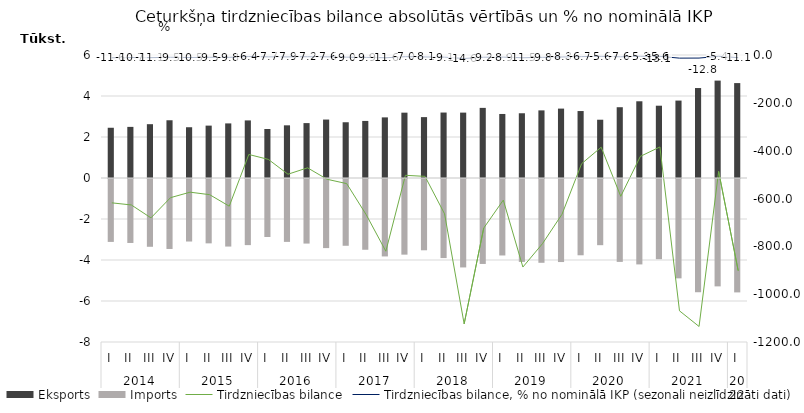
| Category | Eksports | Imports |
|---|---|---|
| 0 | 2450.7 | -3068.8 |
| 1 | 2493.4 | -3120.5 |
| 2 | 2625.5 | -3306.5 |
| 3 | 2816.7 | -3413.2 |
| 4 | 2476.5 | -3050.1 |
| 5 | 2555.2 | -3139.2 |
| 6 | 2663.4 | -3295.5 |
| 7 | 2809.5 | -3225.4 |
| 8 | 2391.5 | -2828.1 |
| 9 | 2569.5 | -3068 |
| 10 | 2678.2 | -3149.9 |
| 11 | 2850.8 | -3370.5 |
| 12 | 2719.6 | -3257.4 |
| 13 | 2783.8 | -3452 |
| 14 | 2956.9 | -3777.4 |
| 15 | 3187 | -3690 |
| 16 | 2969.9 | -3477.4 |
| 17 | 3193.3 | -3857.4 |
| 18 | 3189.7 | -4313.9 |
| 19 | 3420.5 | -4144.2 |
| 20 | 3123.6 | -3730.2 |
| 21 | 3158.2 | -4044.8 |
| 22 | 3298.5 | -4087.5 |
| 23 | 3385.3 | -4051.1 |
| 24 | 3266.4 | -3720.9 |
| 25 | 2842.7 | -3228.3 |
| 26 | 3452.8 | -4043.7 |
| 27 | 3742.7 | -4166.6 |
| 28 | 3526.4 | -3910.9 |
| 29 | 3776.6 | -4846.3 |
| 30 | 4388.7 | -5523.8 |
| 31 | 4751.2 | -5238 |
| 32 | 4629.8 | -5531.8 |